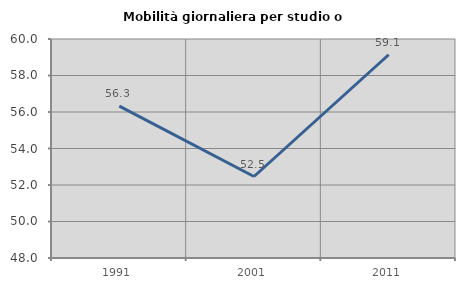
| Category | Mobilità giornaliera per studio o lavoro |
|---|---|
| 1991.0 | 56.322 |
| 2001.0 | 52.465 |
| 2011.0 | 59.137 |